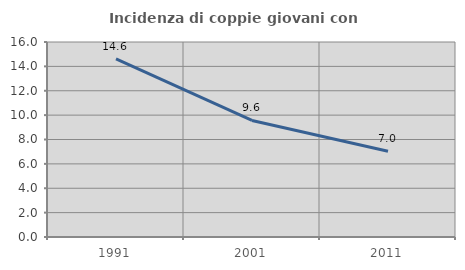
| Category | Incidenza di coppie giovani con figli |
|---|---|
| 1991.0 | 14.613 |
| 2001.0 | 9.565 |
| 2011.0 | 7.038 |